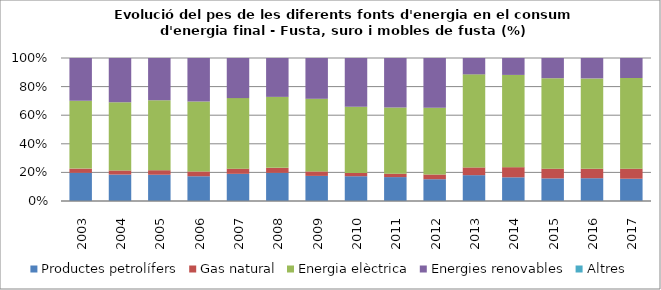
| Category | Productes petrolífers | Gas natural | Energia elèctrica | Energies renovables | Altres |
|---|---|---|---|---|---|
| 2003.0 | 8.7 | 1.3 | 20.9 | 13.2 | 0 |
| 2004.0 | 8.3 | 1.3 | 21.4 | 13.9 | 0 |
| 2005.0 | 8.1 | 1.4 | 21.6 | 13 | 0 |
| 2006.0 | 7.7 | 1.5 | 21.8 | 13.5 | 0 |
| 2007.0 | 8.4 | 1.6 | 21.8 | 12.4 | 0 |
| 2008.0 | 7.9 | 1.4 | 19.9 | 10.9 | 0 |
| 2009.0 | 5.6 | 1 | 16.2 | 9.1 | 0 |
| 2010.0 | 6.1 | 0.8 | 16.3 | 12 | 0 |
| 2011.0 | 5.6 | 0.8 | 15.5 | 11.6 | 0 |
| 2012.0 | 4.6 | 1 | 14.1 | 10.5 | 0 |
| 2013.0 | 3 | 0.9 | 10.8 | 1.9 | 0 |
| 2014.0 | 2.8 | 1.2 | 10.9 | 2 | 0 |
| 2015.0 | 2.8 | 1.2 | 11.2 | 2.5 | 0 |
| 2016.0 | 2.9 | 1.2 | 11.5 | 2.6 | 0 |
| 2017.0 | 2.9 | 1.3 | 11.8 | 2.6 | 0 |